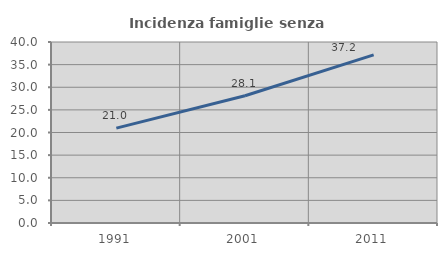
| Category | Incidenza famiglie senza nuclei |
|---|---|
| 1991.0 | 20.97 |
| 2001.0 | 28.117 |
| 2011.0 | 37.15 |